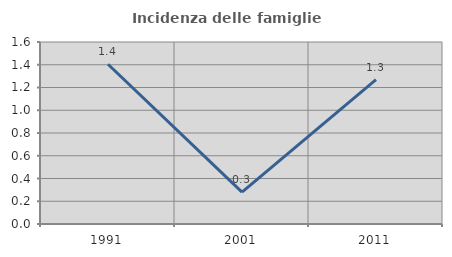
| Category | Incidenza delle famiglie numerose |
|---|---|
| 1991.0 | 1.404 |
| 2001.0 | 0.28 |
| 2011.0 | 1.269 |